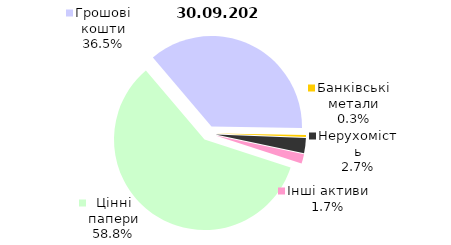
| Category | Series 0 |
|---|---|
| Цінні папери | 2366 |
| Грошові кошти | 1468.079 |
| Банківські метали | 13.464 |
| Нерухомість | 109.428 |
| Інші активи | 67.773 |